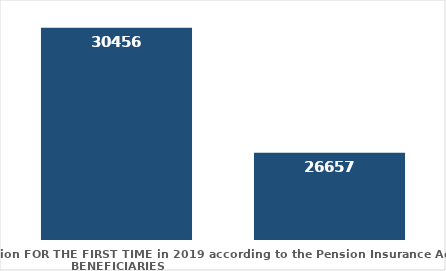
| Category | broj korisnika |
|---|---|
| Pension beneficiaries entitled to pension FOR THE FIRST TIME in 2019 according to the Pension Insurance Act  - NEW BENEFICIARIES | 30456 |
| Pension beneficiaries whose pension entitlement ceased in 2019  -  death caused,   
and who were retired according to the Pension Insurance Act   | 26657 |